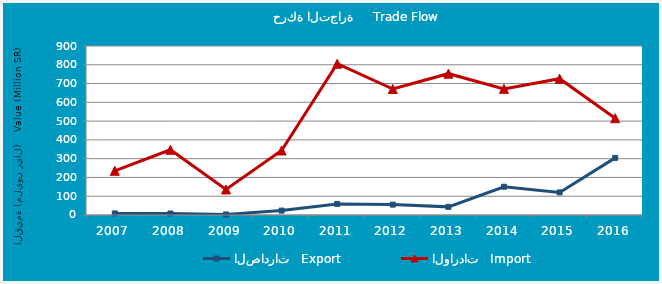
| Category | الصادرات   Export | الواردات   Import |
|---|---|---|
| 2007.0 | 8.4 | 235.406 |
| 2008.0 | 7.91 | 347.277 |
| 2009.0 | 2.945 | 136.096 |
| 2010.0 | 23.438 | 343.705 |
| 2011.0 | 59.07 | 805.451 |
| 2012.0 | 55.32 | 671.023 |
| 2013.0 | 43.289 | 752.591 |
| 2014.0 | 150.38 | 671.759 |
| 2015.0 | 120.358 | 725.906 |
| 2016.0 | 304.26 | 515.388 |